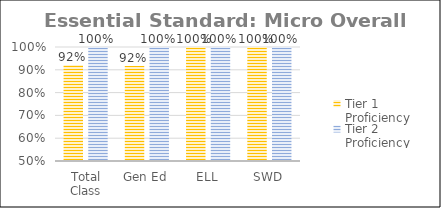
| Category | Tier 1 Proficiency | Tier 2 Proficiency |
|---|---|---|
| Total Class | 0.921 | 1 |
| Gen Ed | 0.917 | 1 |
| ELL | 1 | 1 |
| SWD | 1 | 1 |